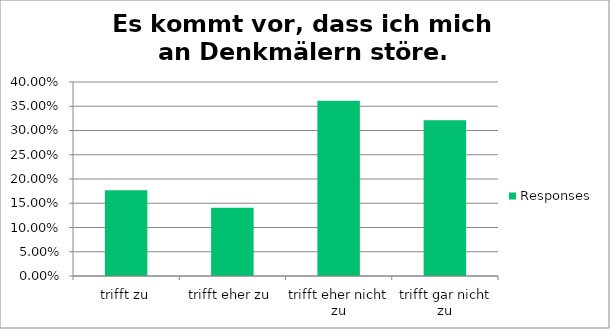
| Category | Responses |
|---|---|
| trifft zu | 0.177 |
| trifft eher zu | 0.141 |
| trifft eher nicht zu | 0.361 |
| trifft gar nicht zu | 0.321 |